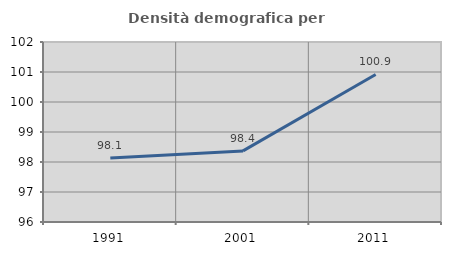
| Category | Densità demografica |
|---|---|
| 1991.0 | 98.132 |
| 2001.0 | 98.37 |
| 2011.0 | 100.917 |